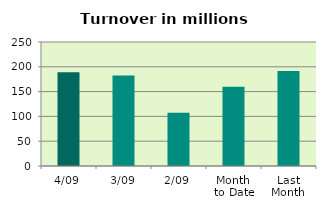
| Category | Series 0 |
|---|---|
| 4/09 | 188.852 |
| 3/09 | 182.704 |
| 2/09 | 107.21 |
| Month 
to Date | 159.589 |
| Last
Month | 191.512 |